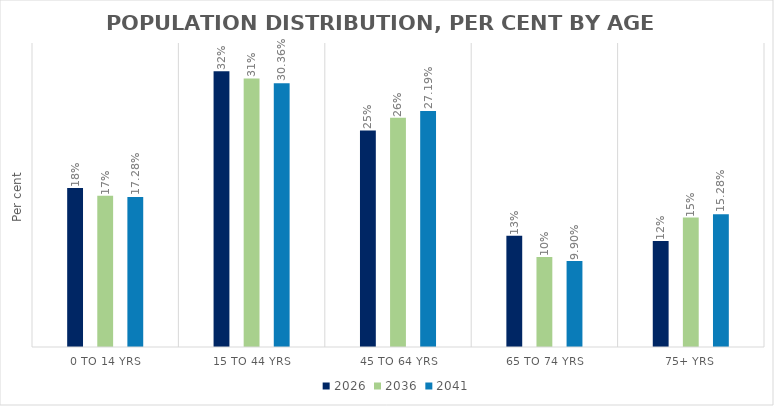
| Category | 2026 | 2036 | 2041 |
|---|---|---|---|
| 0 to 14 yrs | 0.183 | 0.174 | 0.173 |
| 15 to 44 yrs | 0.318 | 0.309 | 0.304 |
| 45 to 64 yrs | 0.249 | 0.264 | 0.272 |
| 65 to 74 yrs | 0.128 | 0.104 | 0.099 |
| 75+ yrs | 0.122 | 0.149 | 0.153 |